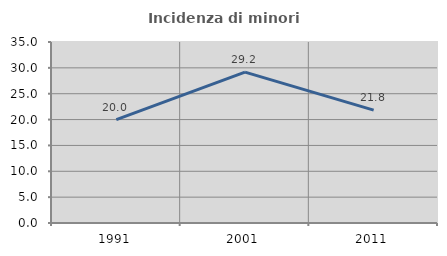
| Category | Incidenza di minori stranieri |
|---|---|
| 1991.0 | 20 |
| 2001.0 | 29.167 |
| 2011.0 | 21.831 |